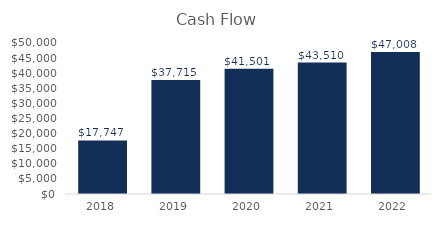
| Category | Series 0 |
|---|---|
| 2018-06-30 | 17747.131 |
| 2019-06-30 | 37715.192 |
| 2020-06-30 | 41501.074 |
| 2021-06-30 | 43510.462 |
| 2022-06-30 | 47008.03 |